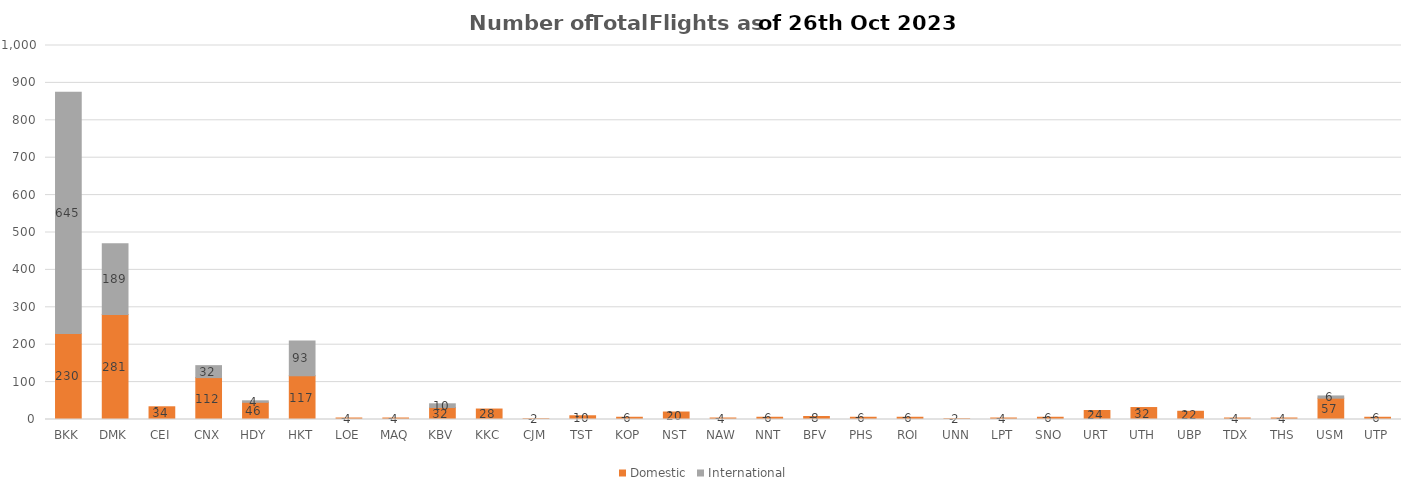
| Category | Domestic | International |
|---|---|---|
| BKK | 230 | 645 |
| DMK | 281 | 189 |
| CEI | 34 | 0 |
| CNX | 112 | 32 |
| HDY | 46 | 4 |
| HKT | 117 | 93 |
| LOE | 4 | 0 |
| MAQ | 4 | 0 |
| KBV | 32 | 10 |
| KKC | 28 | 0 |
| CJM | 2 | 0 |
| TST | 10 | 0 |
| KOP | 6 | 0 |
| NST | 20 | 0 |
| NAW | 4 | 0 |
| NNT | 6 | 0 |
| BFV | 8 | 0 |
| PHS | 6 | 0 |
| ROI | 6 | 0 |
| UNN | 2 | 0 |
| LPT | 4 | 0 |
| SNO | 6 | 0 |
| URT | 24 | 0 |
| UTH | 32 | 0 |
| UBP | 22 | 0 |
| TDX | 4 | 0 |
| THS | 4 | 0 |
| USM | 57 | 6 |
| UTP | 6 | 0 |